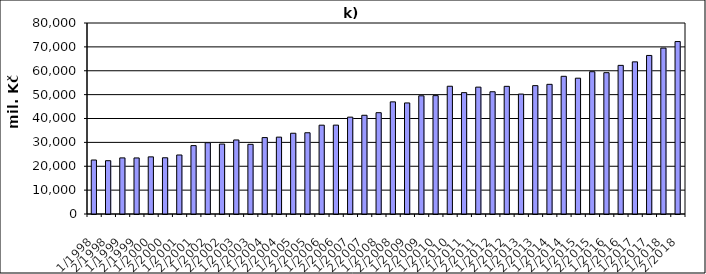
| Category | Series 0 |
|---|---|
| 1/1998 | 22612053.945 |
| 2/1998 | 22324147.545 |
| 1/1999 | 23498902.429 |
| 2/1999 | 23480117.571 |
| 1/2000 | 23931635.368 |
| 2/2000 | 23552446.932 |
| 1/2001 | 24714687.997 |
| 2/2001 | 28643096.708 |
| 1/2002 | 29843588 |
| 2/2002 | 29296127 |
| 1/2003 | 31009529 |
| 2/2003 | 29183260.099 |
| 1/2004 | 32007329.107 |
| 2/2004 | 32198891 |
| 1/2005 | 33822355 |
| 2/2005 | 34026417.794 |
| 1/2006 | 37200339 |
| 2/2006 | 37224064 |
| 1/2007 | 40563572 |
| 2/2007 | 41353196 |
| 1/2008 | 42430605.257 |
| 2/2008 | 46963746.743 |
| 1/2009 | 46516575.12 |
| 2/2009 | 49514710 |
| 1/2010 | 49579307 |
| 2/2010 | 53513867 |
| 1/2011 | 50830634 |
| 2/2011 | 53140892 |
| 1/2012 | 51201166 |
| 2/2012 | 53472635 |
| 1/2013 | 50230974 |
| 2/2013 | 53766872 |
| 1/2014 | 54306637 |
| 2/2014 | 57673803 |
| 1/2015 | 56883064 |
| 2/2015 | 59597039 |
| 1/2016 | 59190759 |
| 2/2016 | 62256486 |
| 1/2017 | 63721989 |
| 2/2017 | 66410452 |
| 1/2018 | 69487350.594 |
| 2/2018 | 72230913.249 |